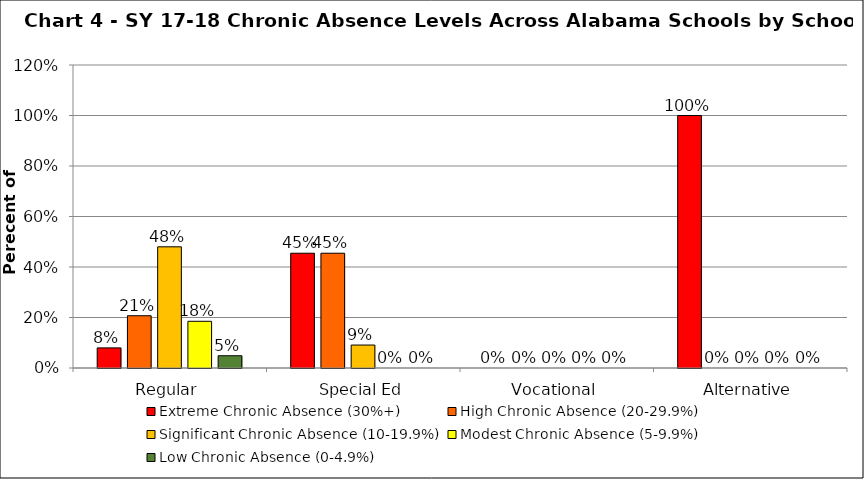
| Category | Extreme Chronic Absence (30%+) | High Chronic Absence (20-29.9%) | Significant Chronic Absence (10-19.9%) | Modest Chronic Absence (5-9.9%) | Low Chronic Absence (0-4.9%) |
|---|---|---|---|---|---|
| 0 | 0.08 | 0.207 | 0.48 | 0.185 | 0.049 |
| 1 | 0.455 | 0.455 | 0.091 | 0 | 0 |
| 2 | 0 | 0 | 0 | 0 | 0 |
| 3 | 1 | 0 | 0 | 0 | 0 |